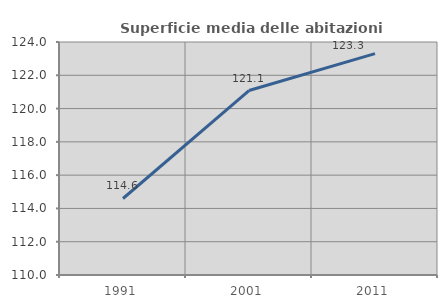
| Category | Superficie media delle abitazioni occupate |
|---|---|
| 1991.0 | 114.597 |
| 2001.0 | 121.084 |
| 2011.0 | 123.304 |